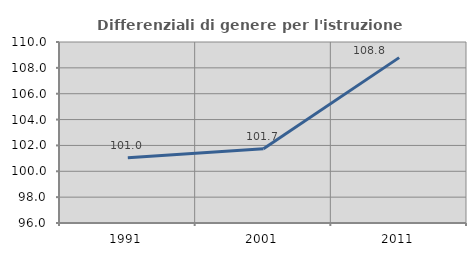
| Category | Differenziali di genere per l'istruzione superiore |
|---|---|
| 1991.0 | 101.047 |
| 2001.0 | 101.749 |
| 2011.0 | 108.791 |